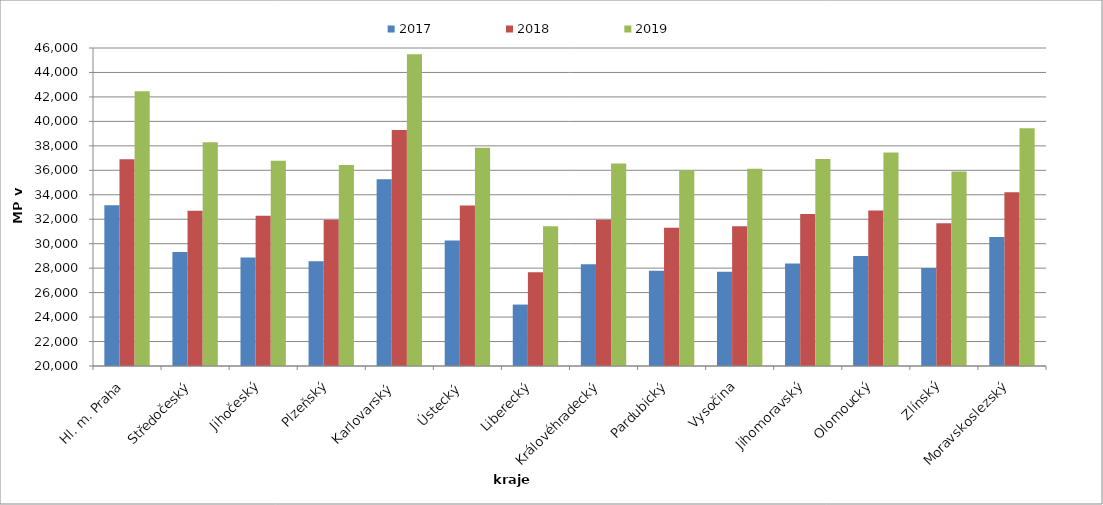
| Category | 2017 | 2018 | 2019 |
|---|---|---|---|
| Hl. m. Praha | 33148.1 | 36912.451 | 42461.912 |
| Středočeský | 29324.053 | 32700.127 | 38296.075 |
| Jihočeský | 28875.565 | 32293.653 | 36790.196 |
| Plzeňský | 28566.538 | 31966.021 | 36426.077 |
| Karlovarský  | 35274.309 | 39295.739 | 45496.795 |
| Ústecký   | 30270.99 | 33119.967 | 37854.516 |
| Liberecký | 25023.481 | 27656.836 | 31430.845 |
| Královéhradecký | 28311.877 | 31967.315 | 36553.611 |
| Pardubický | 27787.624 | 31298.37 | 36012.672 |
| Vysočina | 27710.594 | 31420.93 | 36131.416 |
| Jihomoravský | 28389.935 | 32424.23 | 36925.401 |
| Olomoucký | 28991.882 | 32709.258 | 37445.942 |
| Zlínský | 28015.681 | 31670.294 | 35901.879 |
| Moravskoslezský | 30538.227 | 34202.209 | 39430.535 |